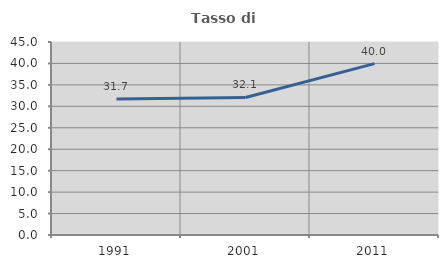
| Category | Tasso di occupazione   |
|---|---|
| 1991.0 | 31.694 |
| 2001.0 | 32.06 |
| 2011.0 | 39.952 |